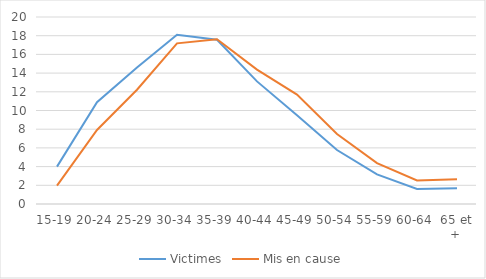
| Category | Victimes | Mis en cause |
|---|---|---|
| 15-19 | 3.995 | 1.973 |
| 20-24 | 10.888 | 7.916 |
| 25-29 | 14.598 | 12.223 |
| 30-34 | 18.097 | 17.179 |
| 35-39 | 17.573 | 17.623 |
| 40-44 | 13.113 | 14.377 |
| 45-49 | 9.503 | 11.699 |
| 50-54 | 5.772 | 7.483 |
| 55-59 | 3.165 | 4.375 |
| 60-64 | 1.615 | 2.513 |
| 65 et + | 1.68 | 2.64 |